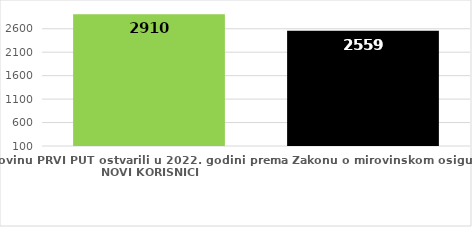
| Category | broj korisnika |
|---|---|
| Korisnici koji su pravo na mirovinu PRVI PUT ostvarili u 2022. godini prema Zakonu o mirovinskom osiguranju - NOVI KORISNICI | 2910 |
| Korisnici mirovina kojima je u 2022. godini PRESTALO PRAVO NA MIROVINU - uzrok smrt 
koji su pravo na mirovinu ostvarili prema Zakonu o mirovinskom osiguranju | 2559 |